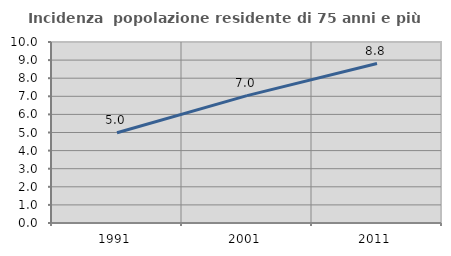
| Category | Incidenza  popolazione residente di 75 anni e più |
|---|---|
| 1991.0 | 4.986 |
| 2001.0 | 7.04 |
| 2011.0 | 8.809 |